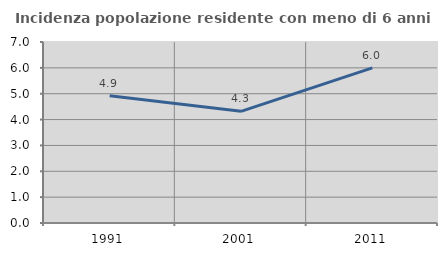
| Category | Incidenza popolazione residente con meno di 6 anni |
|---|---|
| 1991.0 | 4.922 |
| 2001.0 | 4.319 |
| 2011.0 | 5.997 |